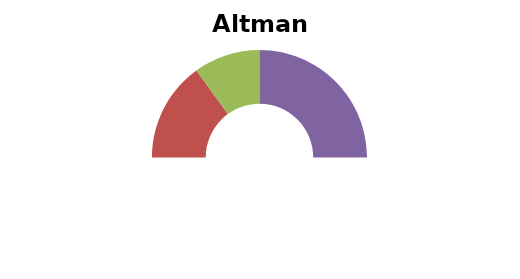
| Category | Altman Score |
|---|---|
| 0 | 0 |
| 1 | 30 |
| 2 | 20 |
| 3 | 50 |
| 4 | 100 |